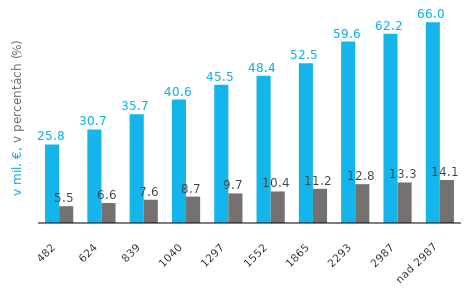
| Category | Series 0 | Series 1 |
|---|---|---|
| 482 | 25.835 | 5.531 |
| 624 | 30.732 | 6.58 |
| 839 | 35.727 | 7.649 |
| 1040 | 40.552 | 8.682 |
| 1297 | 45.463 | 9.734 |
| 1552 | 48.407 | 10.364 |
| 1865 | 52.519 | 11.244 |
| 2293 | 59.645 | 12.77 |
| 2987 | 62.175 | 13.312 |
| nad 2987 | 66.013 | 14.134 |